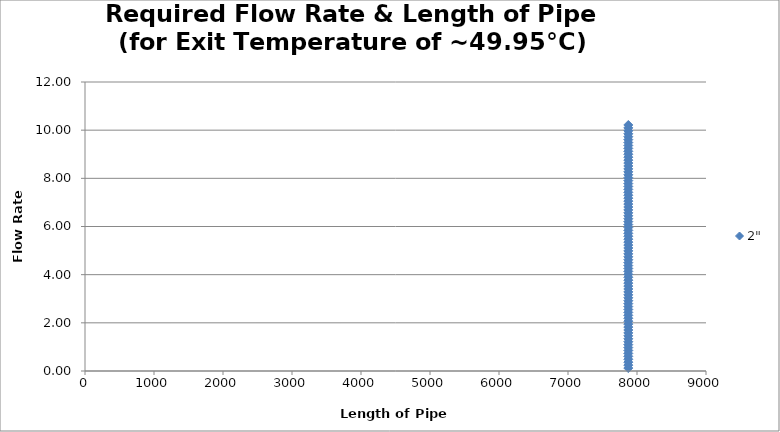
| Category | 2" |
|---|---|
| 7874.01576 | 0.122 |
| 7874.01576 | 0.243 |
| 7874.01576 | 0.365 |
| 7874.01576 | 0.486 |
| 7874.01576 | 0.608 |
| 7874.01576 | 0.73 |
| 7874.01576 | 0.851 |
| 7874.01576 | 0.973 |
| 7874.01576 | 1.094 |
| 7874.01576 | 1.216 |
| 7874.01576 | 1.338 |
| 7874.01576 | 1.459 |
| 7874.01576 | 1.581 |
| 7874.01576 | 1.703 |
| 7874.01576 | 1.824 |
| 7874.01576 | 1.946 |
| 7874.01576 | 2.067 |
| 7874.01576 | 2.189 |
| 7874.01576 | 2.311 |
| 7874.01576 | 2.432 |
| 7874.01576 | 2.554 |
| 7874.01576 | 2.675 |
| 7874.01576 | 2.797 |
| 7874.01576 | 2.919 |
| 7874.01576 | 3.04 |
| 7874.01576 | 3.162 |
| 7874.01576 | 3.283 |
| 7874.01576 | 3.405 |
| 7874.01576 | 3.527 |
| 7874.01576 | 3.648 |
| 7874.01576 | 3.77 |
| 7874.01576 | 3.892 |
| 7874.01576 | 4.013 |
| 7874.01576 | 4.135 |
| 7874.01576 | 4.256 |
| 7874.01576 | 4.378 |
| 7874.01576 | 4.5 |
| 7874.01576 | 4.621 |
| 7874.01576 | 4.743 |
| 7874.01576 | 4.864 |
| 7874.01576 | 4.986 |
| 7874.01576 | 5.108 |
| 7874.01576 | 5.229 |
| 7874.01576 | 5.351 |
| 7874.01576 | 5.472 |
| 7874.01576 | 5.594 |
| 7874.01576 | 5.716 |
| 7874.01576 | 5.837 |
| 7874.01576 | 5.959 |
| 7874.01576 | 6.08 |
| 7874.01576 | 6.202 |
| 7874.01576 | 6.324 |
| 7874.01576 | 6.445 |
| 7874.01576 | 6.567 |
| 7874.01576 | 6.689 |
| 7874.01576 | 6.81 |
| 7874.01576 | 6.932 |
| 7874.01576 | 7.053 |
| 7874.01576 | 7.175 |
| 7874.01576 | 7.297 |
| 7874.01576 | 7.418 |
| 7874.01576 | 7.54 |
| 7874.01576 | 7.661 |
| 7874.01576 | 7.783 |
| 7874.01576 | 7.905 |
| 7874.01576 | 8.026 |
| 7874.01576 | 8.148 |
| 7874.01576 | 8.269 |
| 7874.01576 | 8.391 |
| 7874.01576 | 8.513 |
| 7874.01576 | 8.634 |
| 7874.01576 | 8.756 |
| 7874.01576 | 8.878 |
| 7874.01576 | 8.999 |
| 7874.01576 | 9.121 |
| 7874.01576 | 9.242 |
| 7874.01576 | 9.364 |
| 7874.01576 | 9.486 |
| 7874.01576 | 9.607 |
| 7874.01576 | 9.729 |
| 7874.01576 | 9.85 |
| 7874.01576 | 9.972 |
| 7874.01576 | 10.094 |
| 7874.01576 | 10.215 |